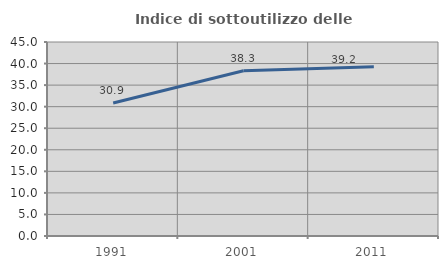
| Category | Indice di sottoutilizzo delle abitazioni  |
|---|---|
| 1991.0 | 30.863 |
| 2001.0 | 38.316 |
| 2011.0 | 39.234 |